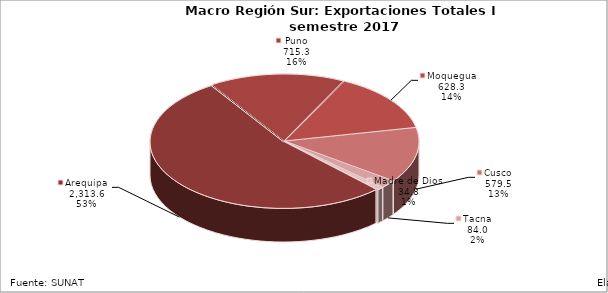
| Category | Series 0 |
|---|---|
| Arequipa | 2313.597 |
| Puno | 715.314 |
| Moquegua | 628.264 |
| Cusco | 579.451 |
| Tacna | 84.004 |
| Madre de Dios | 34.825 |